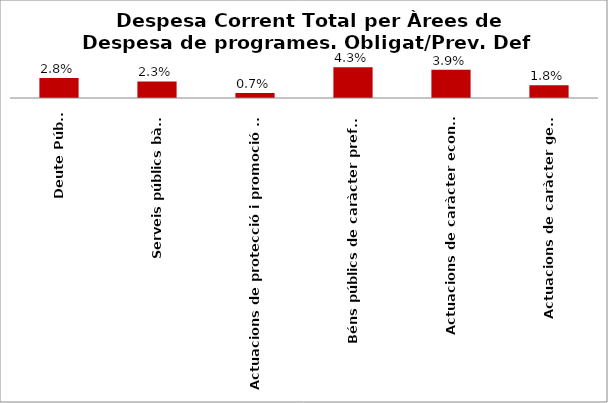
| Category | Series 0 |
|---|---|
| Deute Públic | 0.028 |
| Serveis públics bàsics | 0.023 |
| Actuacions de protecció i promoció social | 0.007 |
| Béns públics de caràcter preferent | 0.043 |
| Actuacions de caràcter econòmic | 0.039 |
| Actuacions de caràcter general | 0.018 |